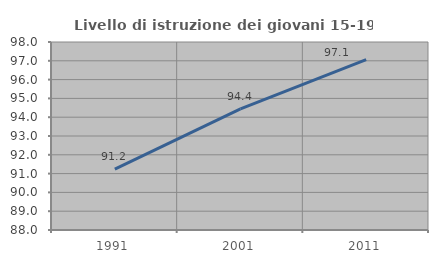
| Category | Livello di istruzione dei giovani 15-19 anni |
|---|---|
| 1991.0 | 91.237 |
| 2001.0 | 94.444 |
| 2011.0 | 97.059 |